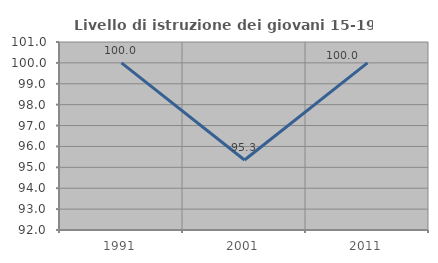
| Category | Livello di istruzione dei giovani 15-19 anni |
|---|---|
| 1991.0 | 100 |
| 2001.0 | 95.349 |
| 2011.0 | 100 |